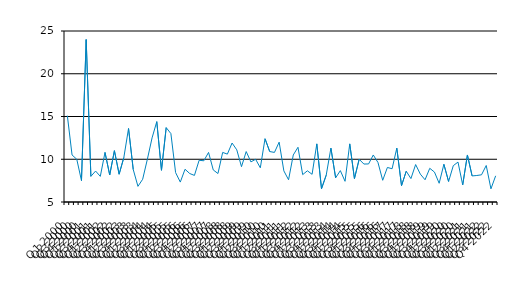
| Category | Series 0 |
|---|---|
| Q1 2000 | 15.1 |
| Q2 2000 | 10.5 |
| Q3 2000 | 10 |
| Q4 2000 | 7.5 |
| Q1 2001 | 24 |
| Q2 2001 | 8 |
| Q3 2001 | 8.62 |
| Q4 2001 | 8 |
| Q1 2002 | 10.8 |
| Q2 2002 | 8.16 |
| Q3 2002 | 11 |
| Q4 2002 | 8.25 |
| Q1 2003 | 10.2 |
| Q2 2003 | 13.6 |
| Q3 2003 | 8.8 |
| Q4 2003 | 6.83 |
| Q1 2004 | 7.66 |
| Q2 2004 | 10 |
| Q3 2004 | 12.5 |
| Q4 2004 | 14.4 |
| Q1 2005 | 8.71 |
| Q2 2005 | 13.7 |
| Q3 2005 | 13 |
| Q4 2005 | 8.44 |
| Q1 2006 | 7.33 |
| Q2 2006 | 8.83 |
| Q3 2006 | 8.33 |
| Q4 2006 | 8.11 |
| Q1 2007 | 9.88 |
| Q2 2007 | 9.82 |
| Q3 2007 | 10.8 |
| Q4 2007 | 8.75 |
| Q1 2008 | 8.33 |
| Q2 2008 | 10.8 |
| Q3 2008 | 10.6 |
| Q4 2008 | 11.9 |
| Q1 2009 | 11.1 |
| Q2 2009 | 9.13 |
| Q3 2009 | 10.9 |
| Q4 2009 | 9.69 |
| Q1 2010 | 10 |
| Q2 2010 | 9 |
| Q3 2010 | 12.4 |
| Q4 2010 | 10.9 |
| Q1 2011 | 10.8 |
| Q2 2011 | 12 |
| Q3 2011 | 8.64 |
| Q4 2011 | 7.6 |
| Q1 2012 | 10.5 |
| Q2 2012 | 11.4 |
| Q3 2012 | 8.2 |
| Q4 2012 | 8.65 |
| Q1 2013 | 8.24 |
| Q2 2013 | 11.8 |
| Q3 2013 | 6.55 |
| Q4 2013 | 8.14 |
| Q1 2014 | 11.3 |
| Q2 2014 | 7.83 |
| Q3 2014 | 8.67 |
| Q4 2014 | 7.42 |
| Q1 2015 | 11.8 |
| Q2 2015 | 7.74 |
| Q3 2015 | 10 |
| Q4 2015 | 9.44 |
| Q1 2016 | 9.45 |
| Q2 2016 | 10.5 |
| Q3 2016 | 9.62 |
| Q4 2016 | 7.54 |
| Q1 2017 | 9.04 |
| Q2 2017 | 8.89 |
| Q3 2017 | 11.3 |
| Q4 2017 | 6.91 |
| Q1 2018 | 8.6 |
| Q2 2018 | 7.74 |
| Q3 2018 | 9.38 |
| Q4 2018 | 8.26 |
| Q1 2019 | 7.6 |
| Q2 2019 | 8.941 |
| Q3 2019 | 8.5 |
| Q4 2019 | 7.19 |
| Q1 2020 | 9.41 |
| Q2 2020 | 7.4 |
| Q3 2020 | 9.25 |
| Q4 2020 | 9.67 |
| Q1 2021 | 7 |
| Q2 2021 | 10.5 |
| Q3 2021 | 8.05 |
| Q4 2021 | 8.1 |
| Q1 2022 | 8.18 |
| Q2 2022 | 9.27 |
| Q3 2022 | 6.54 |
| Q4 2022 | 8.06 |